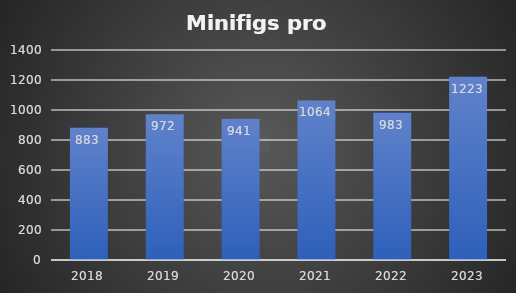
| Category | Minifigs |
|---|---|
| 2018.0 | 883 |
| 2019.0 | 972 |
| 2020.0 | 941 |
| 2021.0 | 1064 |
| 2022.0 | 983 |
| 2023.0 | 1223 |